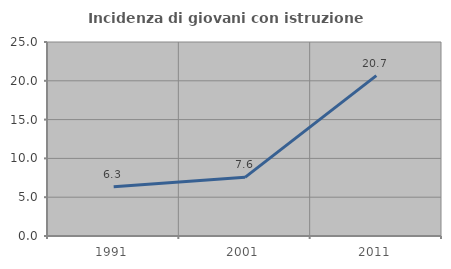
| Category | Incidenza di giovani con istruzione universitaria |
|---|---|
| 1991.0 | 6.346 |
| 2001.0 | 7.563 |
| 2011.0 | 20.67 |